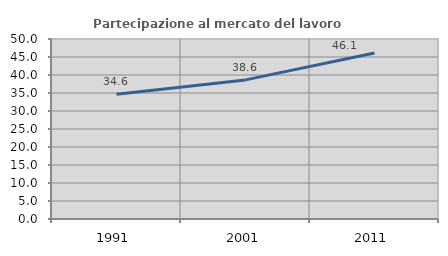
| Category | Partecipazione al mercato del lavoro  femminile |
|---|---|
| 1991.0 | 34.626 |
| 2001.0 | 38.64 |
| 2011.0 | 46.118 |